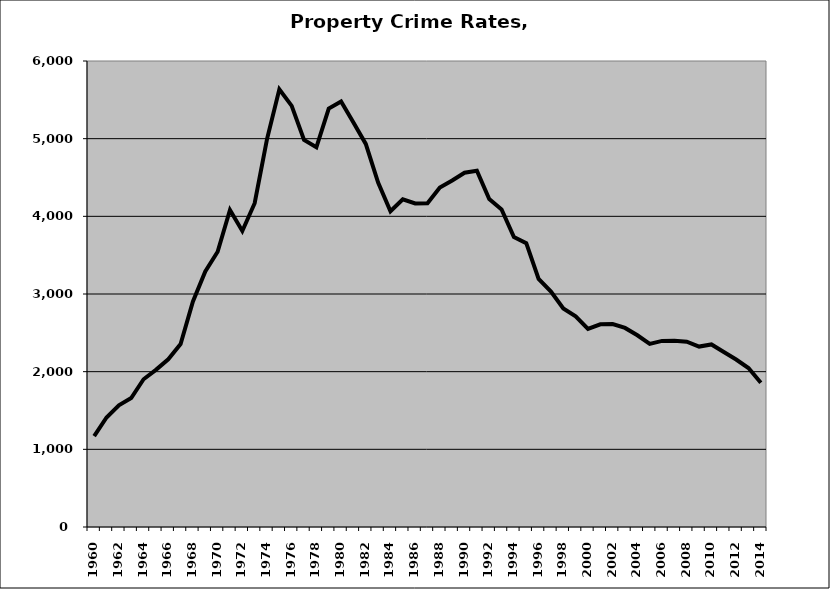
| Category | Property |
|---|---|
| 1960.0 | 1170.323 |
| 1961.0 | 1409.687 |
| 1962.0 | 1567.526 |
| 1963.0 | 1659.678 |
| 1964.0 | 1902.211 |
| 1965.0 | 2022.906 |
| 1966.0 | 2160.059 |
| 1967.0 | 2354.51 |
| 1968.0 | 2903.918 |
| 1969.0 | 3290.671 |
| 1970.0 | 3543.434 |
| 1971.0 | 4081.539 |
| 1972.0 | 3811.837 |
| 1973.0 | 4169.062 |
| 1974.0 | 4994.241 |
| 1975.0 | 5635.261 |
| 1976.0 | 5421.69 |
| 1977.0 | 4983.708 |
| 1978.0 | 4888.466 |
| 1979.0 | 5386.653 |
| 1980.0 | 5477.85 |
| 1981.0 | 5206.724 |
| 1982.0 | 4932.365 |
| 1983.0 | 4433.969 |
| 1984.0 | 4064.764 |
| 1985.0 | 4219.598 |
| 1986.0 | 4166.478 |
| 1987.0 | 4169.172 |
| 1988.0 | 4371.3 |
| 1989.0 | 4461.018 |
| 1990.0 | 4561.546 |
| 1991.0 | 4586.224 |
| 1992.0 | 4223.808 |
| 1993.0 | 4089.005 |
| 1994.0 | 3733.355 |
| 1995.0 | 3654.445 |
| 1996.0 | 3194.944 |
| 1997.0 | 3031.007 |
| 1998.0 | 2814.56 |
| 1999.0 | 2711.456 |
| 2000.0 | 2549.985 |
| 2001.0 | 2610.135 |
| 2002.0 | 2612.243 |
| 2003.0 | 2562.833 |
| 2004.0 | 2468.247 |
| 2005.0 | 2358.438 |
| 2006.0 | 2395.967 |
| 2007.0 | 2399.238 |
| 2008.0 | 2385.279 |
| 2009.0 | 2323.136 |
| 2010.0 | 2350.546 |
| 2011.0 | 2252.595 |
| 2012.0 | 2156.787 |
| 2013.0 | 2046.156 |
| 2014.0 | 1857.071 |